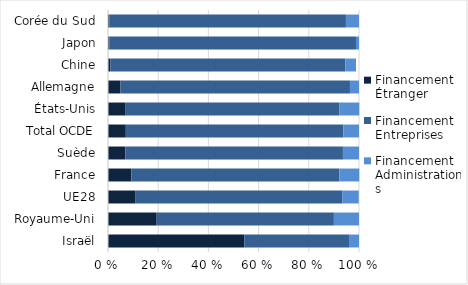
| Category | Financement Étranger | Financement Entreprises | Financement Administrations |
|---|---|---|---|
| Israël | 54.3 | 42 | 3.7 |
| Royaume-Uni | 19.4 | 70.6 | 10 |
| UE28 | 10.8 | 82.5 | 6.6 |
| France | 9.3 | 82.9 | 7.9 |
| Suède | 6.9 | 86.7 | 6.4 |
| Total OCDE | 7.1 | 86.7 | 6.2 |
| États-Unis | 6.8 | 85.3 | 8 |
| Allemagne | 5 | 91.4 | 3.6 |
| Chine | 0.9 | 93.7 | 4.2 |
| Japon | 0.5 | 98.3 | 1.2 |
| Corée du Sud | 0.6 | 94.2 | 5.2 |